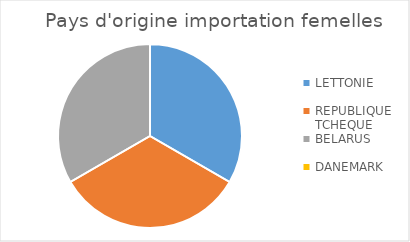
| Category | Series 0 |
|---|---|
| LETTONIE | 1 |
| REPUBLIQUE TCHEQUE | 1 |
| BELARUS | 1 |
| DANEMARK | 0 |